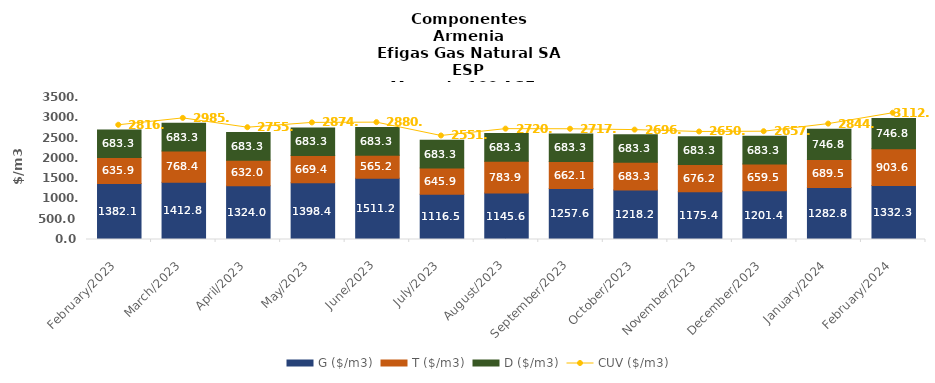
| Category | G ($/m3) | T ($/m3) | D ($/m3) |
|---|---|---|---|
| 2023-02-01 | 1382.137 | 635.944 | 683.343 |
| 2023-03-01 | 1412.843 | 768.353 | 683.343 |
| 2023-04-01 | 1324.021 | 631.998 | 683.343 |
| 2023-05-01 | 1398.419 | 669.403 | 683.343 |
| 2023-06-01 | 1511.242 | 565.219 | 683.343 |
| 2023-07-01 | 1116.463 | 645.939 | 683.343 |
| 2023-08-01 | 1145.565 | 783.894 | 683.343 |
| 2023-09-01 | 1257.568 | 662.12 | 683.343 |
| 2023-10-01 | 1218.237 | 683.343 | 683.34 |
| 2023-11-01 | 1175.364 | 676.175 | 683.343 |
| 2023-12-01 | 1201.409 | 659.456 | 683.343 |
| 2024-01-01 | 1282.796 | 689.52 | 746.758 |
| 2024-02-01 | 1332.332 | 903.58 | 746.758 |